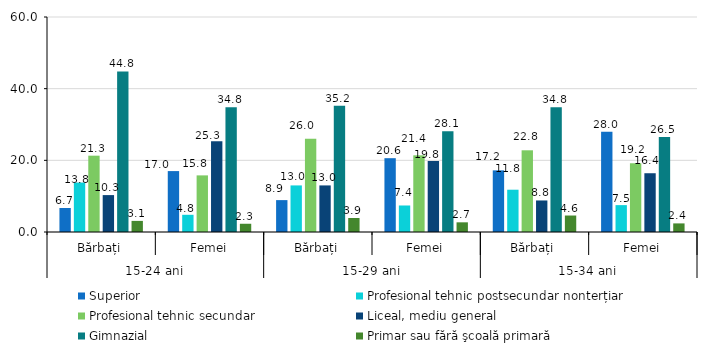
| Category | Superior | Profesional tehnic postsecundar nonterțiar | Profesional tehnic secundar | Liceal, mediu general | Gimnazial | Primar sau fără şcoală primară |
|---|---|---|---|---|---|---|
| 0 | 6.7 | 13.8 | 21.3 | 10.3 | 44.8 | 3.1 |
| 1 | 17 | 4.8 | 15.8 | 25.3 | 34.8 | 2.3 |
| 2 | 8.9 | 13 | 26 | 13 | 35.2 | 3.9 |
| 3 | 20.6 | 7.4 | 21.4 | 19.8 | 28.1 | 2.7 |
| 4 | 17.2 | 11.8 | 22.8 | 8.8 | 34.8 | 4.6 |
| 5 | 28 | 7.5 | 19.2 | 16.4 | 26.5 | 2.4 |